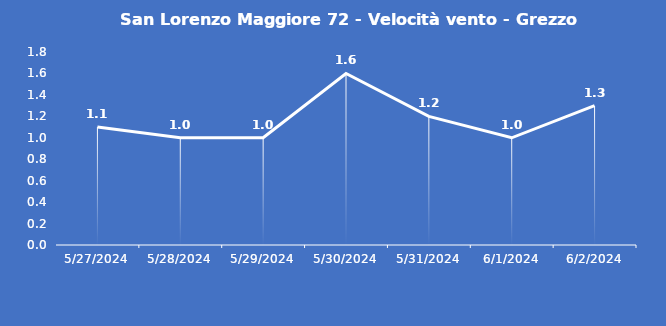
| Category | San Lorenzo Maggiore 72 - Velocità vento - Grezzo (m/s) |
|---|---|
| 5/27/24 | 1.1 |
| 5/28/24 | 1 |
| 5/29/24 | 1 |
| 5/30/24 | 1.6 |
| 5/31/24 | 1.2 |
| 6/1/24 | 1 |
| 6/2/24 | 1.3 |